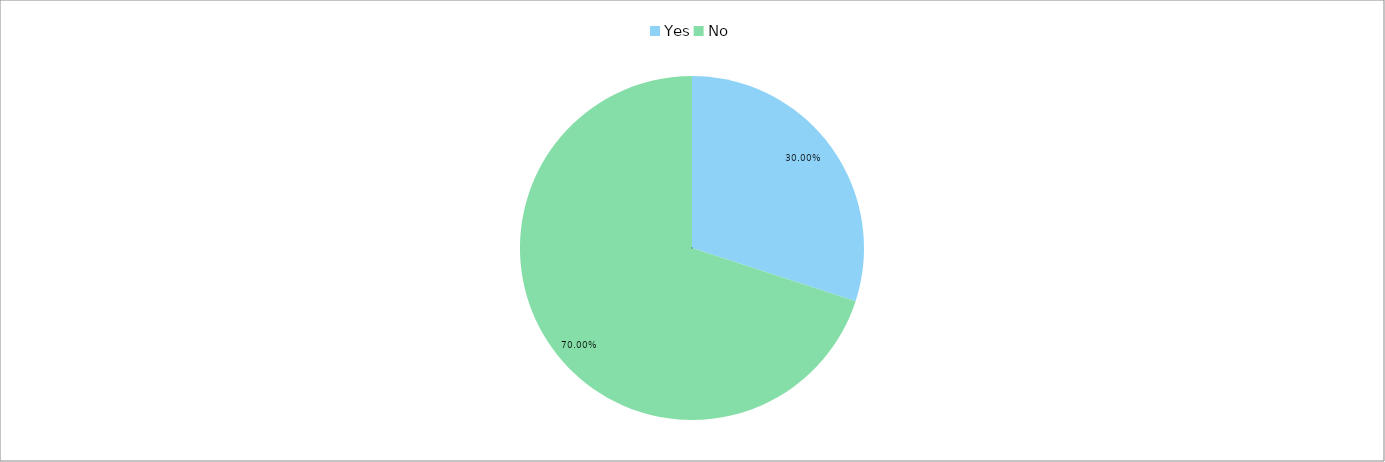
| Category | Total (% & freq col) |
|---|---|
| Yes | 0.3 |
| No | 0.7 |